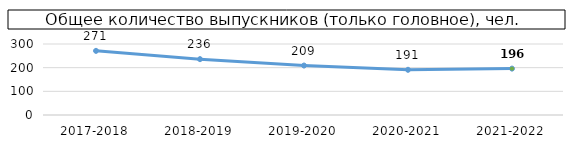
| Category | Series 0 |
|---|---|
| 2017-2018 | 271 |
| 2018-2019 | 236 |
| 2019-2020 | 209 |
| 2020-2021 | 191 |
| 2021-2022 | 196 |